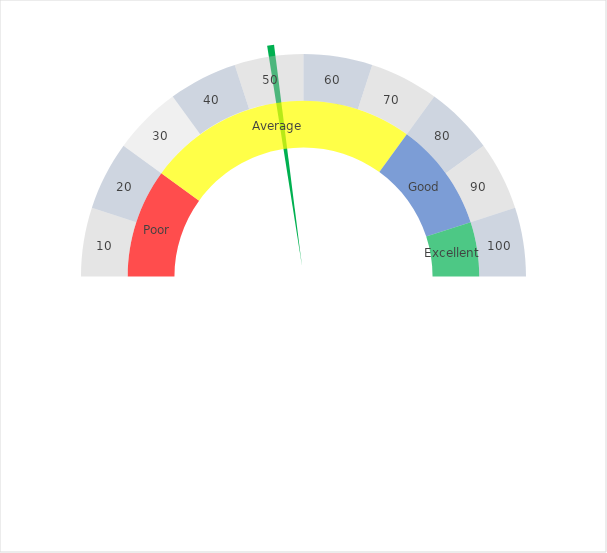
| Category | Pointer |
|---|---|
| 0 | 45 |
| 1 | 1 |
| 2 | 154 |